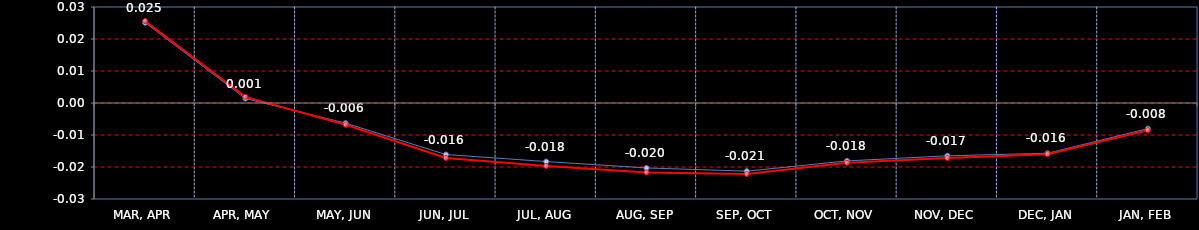
| Category | Last | Settlement | First MA | Second MA | Third MA |
|---|---|---|---|---|---|
| MAR, APR | 0.025 | 0.026 |  |  |  |
| APR, MAY | 0.001 | 0.002 |  |  |  |
| MAY, JUN | -0.006 | -0.007 |  |  |  |
| JUN, JUL | -0.016 | -0.017 |  |  |  |
| JUL, AUG | -0.018 | -0.02 |  |  |  |
| AUG, SEP | -0.02 | -0.022 |  |  |  |
| SEP, OCT | -0.021 | -0.022 |  |  |  |
| OCT, NOV | -0.018 | -0.019 |  |  |  |
| NOV, DEC | -0.017 | -0.017 |  |  |  |
| DEC, JAN | -0.016 | -0.016 |  |  |  |
| JAN, FEB | -0.008 | -0.009 |  |  |  |